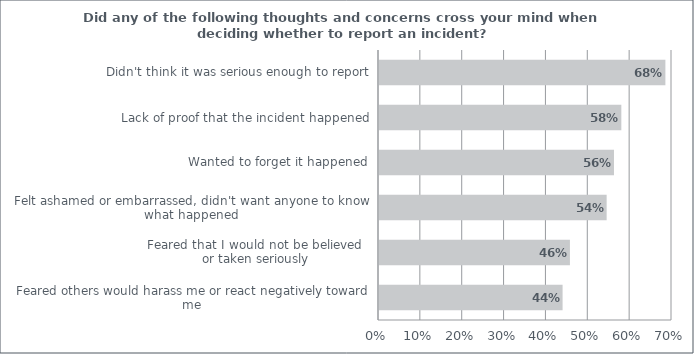
| Category | Series 0 |
|---|---|
| Feared others would harass me or react negatively toward me | 0.439 |
| Feared that I would not be believed 
or taken seriously | 0.456 |
| Felt ashamed or embarrassed, didn't want anyone to know what happened | 0.544 |
| Wanted to forget it happened | 0.561 |
| Lack of proof that the incident happened | 0.579 |
| Didn't think it was serious enough to report | 0.684 |